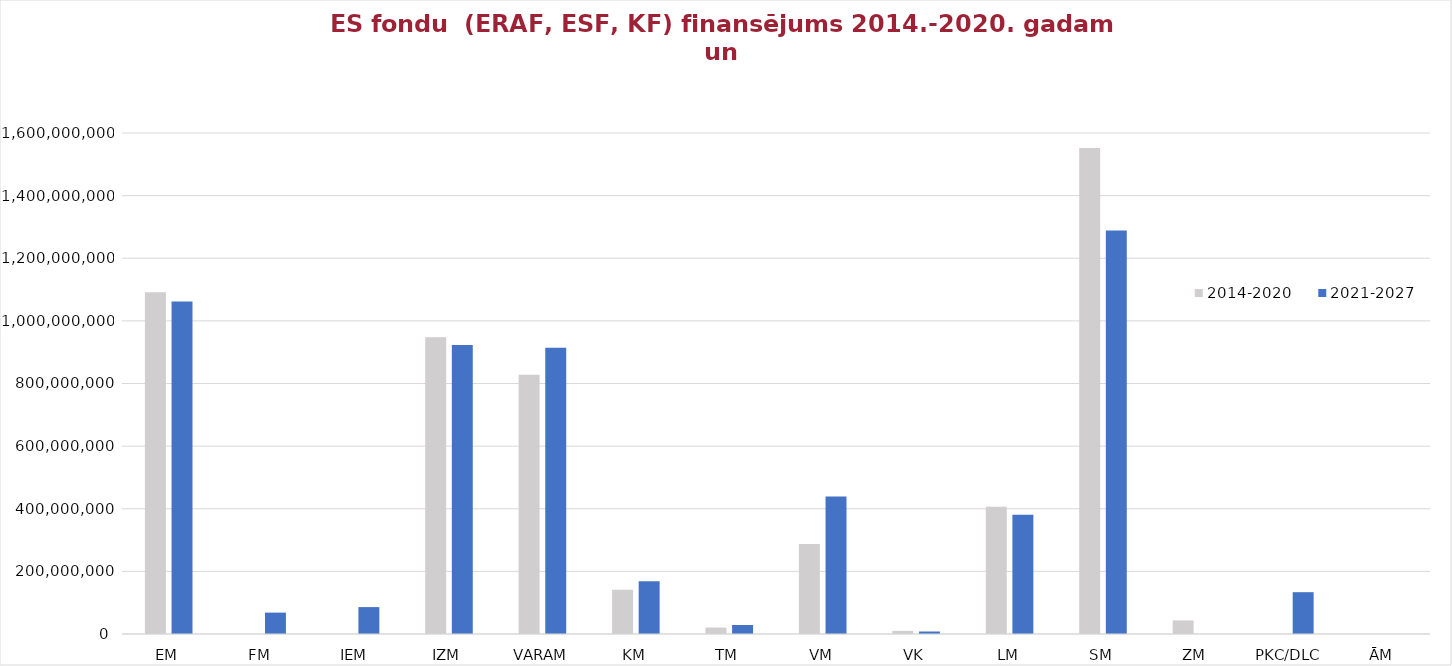
| Category | 2014-2020 | 2021-2027 |
|---|---|---|
| EM | 1091048265 | 1062000000 |
| FM | 0 | 68300000 |
| IEM | 0 | 85920569 |
| IZM | 947312099 | 923212848 |
| VARAM | 827774148 | 914474489.643 |
| KM | 140927341 | 168597200 |
| TM | 20577086 | 28817500 |
| VM | 287085744 | 439009411 |
| VK | 10081616 | 8000000 |
| LM | 406015372 | 380500000 |
| SM | 1552182762 | 1288540694.75 |
| ZM | 43390019 | 0 |
| PKC/DLC | 0 | 133540434.5 |
| ĀM | 0 | 0 |